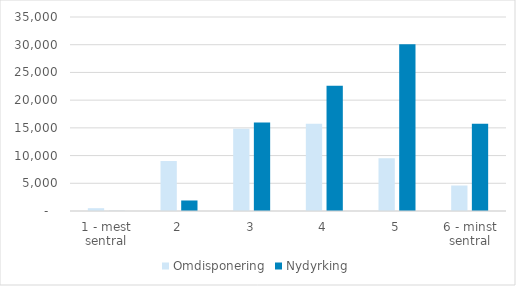
| Category | Omdisponering | Nydyrking |
|---|---|---|
| 1 - mest sentral | 505 | 10 |
| 2 | 9015 | 1898 |
| 3 | 14826 | 15953 |
| 4 | 15750 | 22586 |
| 5 | 9537 | 30083 |
| 6 - minst sentral | 4597 | 15728 |